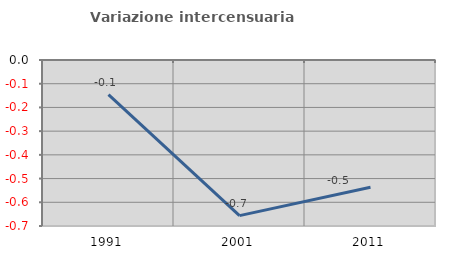
| Category | Variazione intercensuaria annua |
|---|---|
| 1991.0 | -0.146 |
| 2001.0 | -0.656 |
| 2011.0 | -0.536 |